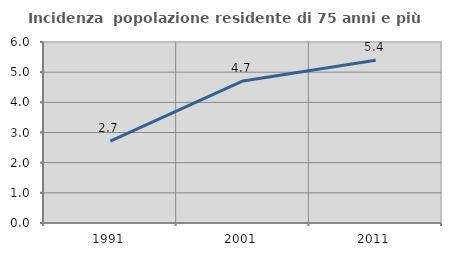
| Category | Incidenza  popolazione residente di 75 anni e più |
|---|---|
| 1991.0 | 2.714 |
| 2001.0 | 4.708 |
| 2011.0 | 5.395 |